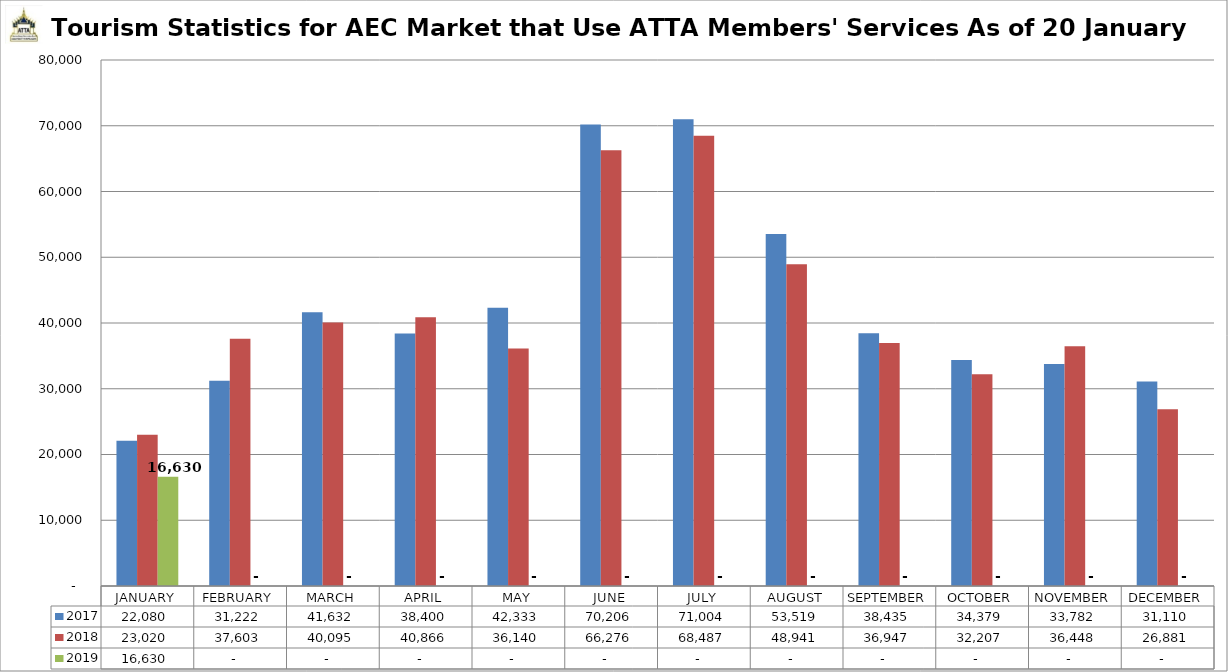
| Category | 2017 | 2018 | 2019 |
|---|---|---|---|
| JANUARY | 22080 | 23020 | 16630 |
| FEBRUARY | 31222 | 37603 | 0 |
| MARCH | 41632 | 40095 | 0 |
| APRIL | 38400 | 40866 | 0 |
| MAY | 42333 | 36140 | 0 |
| JUNE | 70206 | 66276 | 0 |
| JULY | 71004 | 68487 | 0 |
| AUGUST | 53519 | 48941 | 0 |
| SEPTEMBER | 38435 | 36947 | 0 |
| OCTOBER | 34379 | 32207 | 0 |
| NOVEMBER | 33782 | 36448 | 0 |
| DECEMBER | 31110 | 26881 | 0 |